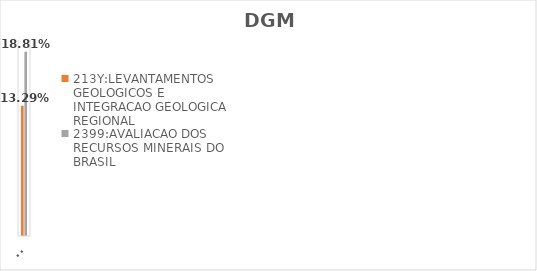
| Category | 213Y:LEVANTAMENTOS GEOLOGICOS E INTEGRACAO GEOLOGICA REGIONAL | 2399:AVALIACAO DOS RECURSOS MINERAIS DO BRASIL |
|---|---|---|
| EXECUTADO | 0.133 | 0.188 |